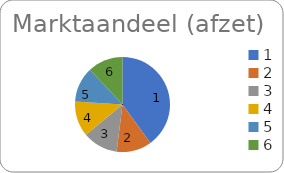
| Category | Series 0 |
|---|---|
| 1.0 | 0.4 |
| 2.0 | 0.12 |
| 3.0 | 0.12 |
| 4.0 | 0.12 |
| 5.0 | 0.12 |
| 6.0 | 0.12 |